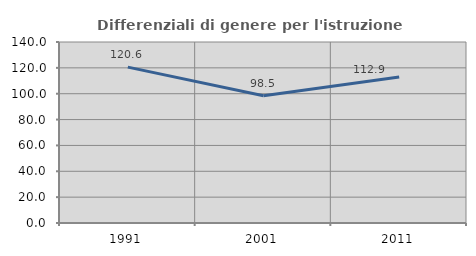
| Category | Differenziali di genere per l'istruzione superiore |
|---|---|
| 1991.0 | 120.577 |
| 2001.0 | 98.488 |
| 2011.0 | 112.93 |